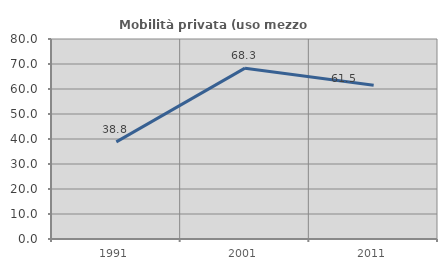
| Category | Mobilità privata (uso mezzo privato) |
|---|---|
| 1991.0 | 38.849 |
| 2001.0 | 68.333 |
| 2011.0 | 61.458 |